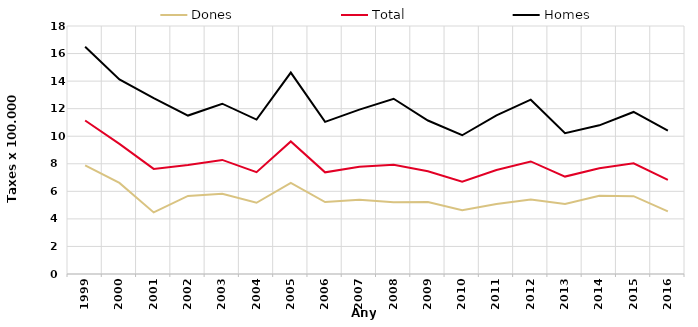
| Category | Dones | Total | Homes |
|---|---|---|---|
| 1999.0 | 7.89 | 11.14 | 16.49 |
| 2000.0 | 6.61 | 9.44 | 14.12 |
| 2001.0 | 4.47 | 7.63 | 12.76 |
| 2002.0 | 5.67 | 7.91 | 11.5 |
| 2003.0 | 5.83 | 8.28 | 12.36 |
| 2004.0 | 5.17 | 7.39 | 11.21 |
| 2005.0 | 6.61 | 9.62 | 14.62 |
| 2006.0 | 5.22 | 7.38 | 11.04 |
| 2007.0 | 5.38 | 7.78 | 11.93 |
| 2008.0 | 5.21 | 7.93 | 12.72 |
| 2009.0 | 5.22 | 7.46 | 11.14 |
| 2010.0 | 4.62 | 6.7 | 10.07 |
| 2011.0 | 5.08 | 7.55 | 11.51 |
| 2012.0 | 5.4 | 8.17 | 12.65 |
| 2013.0 | 5.09 | 7.07 | 10.22 |
| 2014.0 | 5.68 | 7.67 | 10.79 |
| 2015.0 | 5.65 | 8.04 | 11.76 |
| 2016.0 | 4.54 | 6.83 | 10.4 |